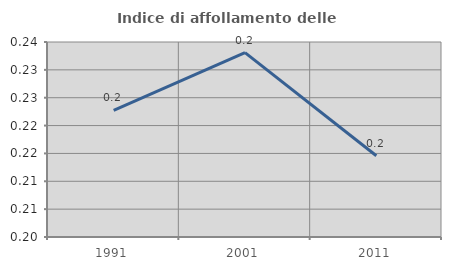
| Category | Indice di affollamento delle abitazioni  |
|---|---|
| 1991.0 | 0.223 |
| 2001.0 | 0.233 |
| 2011.0 | 0.215 |